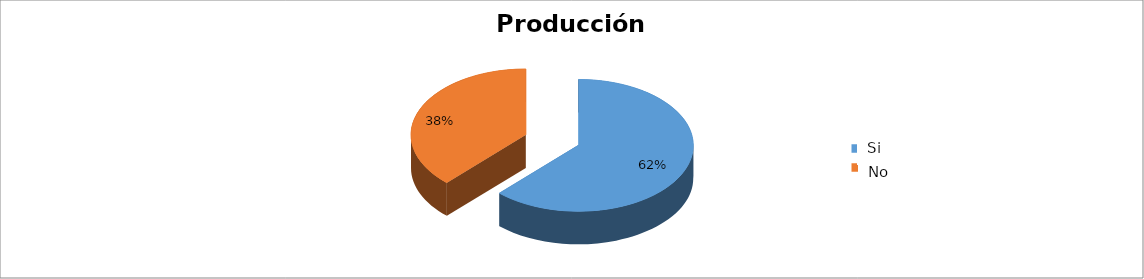
| Category | Series 0 |
|---|---|
| 0 | 0.621 |
| 1 | 0.379 |